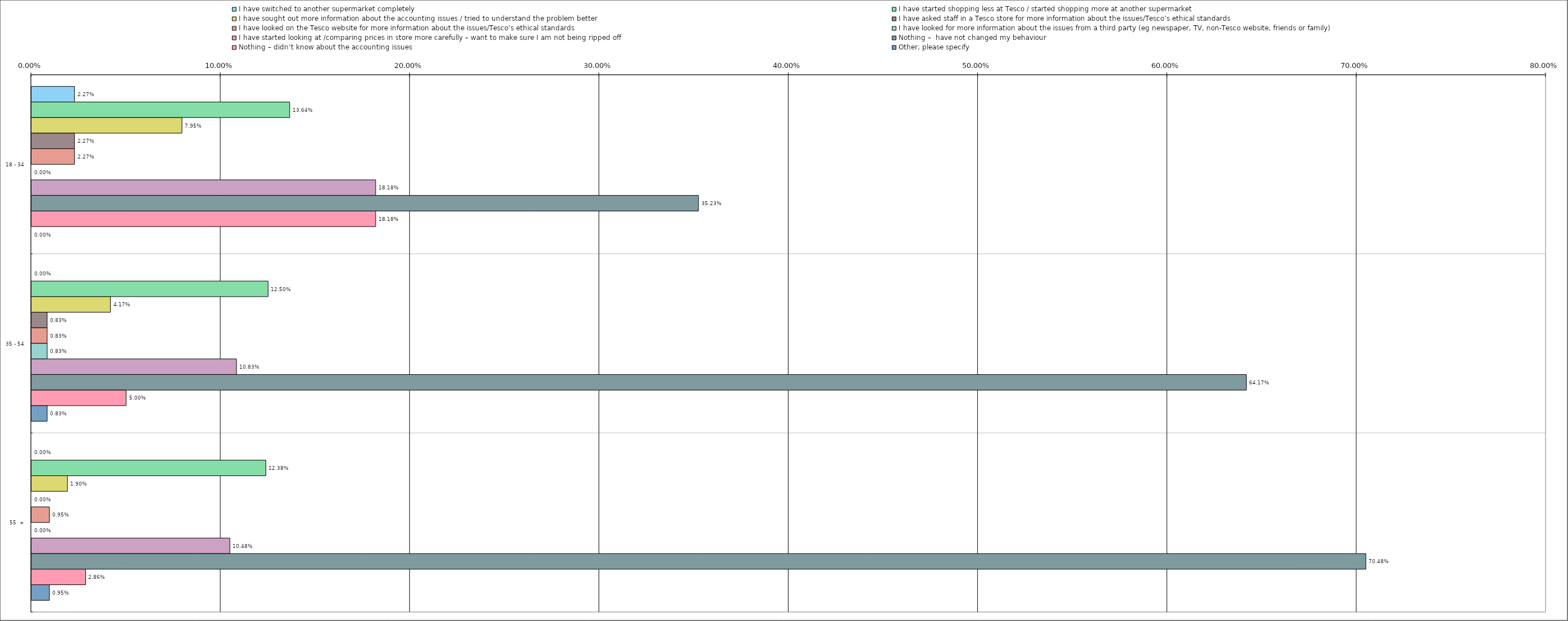
| Category | I have switched to another supermarket completely | I have started shopping less at Tesco / started shopping more at another supermarket | I have sought out more information about the accounting issues / tried to understand the problem better | I have asked staff in a Tesco store for more information about the issues/Tesco’s ethical standards | I have looked on the Tesco website for more information about the issues/Tesco’s ethical standards | I have looked for more information about the issues from a third party (eg newspaper, TV, non-Tesco website, friends or family) | I have started looking at /comparing prices in store more carefully – want to make sure I am not being ripped off | Nothing –  have not changed my behaviour | Nothing – didn’t know about the accounting issues | Other, please specify |
|---|---|---|---|---|---|---|---|---|---|---|
| 0 | 0.023 | 0.136 | 0.08 | 0.023 | 0.023 | 0 | 0.182 | 0.352 | 0.182 | 0 |
| 1 | 0 | 0.125 | 0.042 | 0.008 | 0.008 | 0.008 | 0.108 | 0.642 | 0.05 | 0.008 |
| 2 | 0 | 0.124 | 0.019 | 0 | 0.01 | 0 | 0.105 | 0.705 | 0.029 | 0.01 |